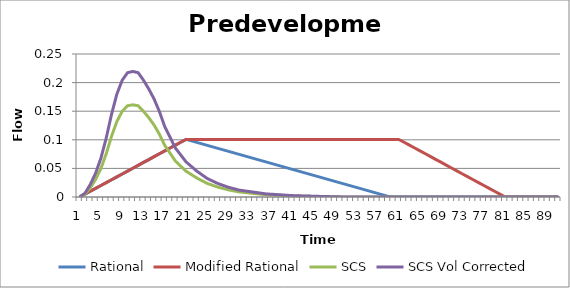
| Category | Rational | Modified Rational | SCS | SCS Vol Corrected |
|---|---|---|---|---|
| 0 | 0 | 0 | 0 | 0 |
| 1 | 0.005 | 0.005 | 0.005 | 0.007 |
| 2 | 0.01 | 0.01 | 0.016 | 0.022 |
| 3 | 0.015 | 0.015 | 0.031 | 0.042 |
| 4 | 0.02 | 0.02 | 0.05 | 0.068 |
| 5 | 0.025 | 0.025 | 0.076 | 0.103 |
| 6 | 0.03 | 0.03 | 0.106 | 0.145 |
| 7 | 0.035 | 0.035 | 0.132 | 0.18 |
| 8 | 0.04 | 0.04 | 0.15 | 0.204 |
| 9 | 0.045 | 0.045 | 0.16 | 0.217 |
| 10 | 0.05 | 0.05 | 0.161 | 0.22 |
| 11 | 0.055 | 0.055 | 0.16 | 0.217 |
| 12 | 0.06 | 0.06 | 0.15 | 0.204 |
| 13 | 0.065 | 0.065 | 0.139 | 0.189 |
| 14 | 0.07 | 0.07 | 0.126 | 0.171 |
| 15 | 0.076 | 0.076 | 0.11 | 0.149 |
| 16 | 0.081 | 0.081 | 0.09 | 0.123 |
| 17 | 0.086 | 0.086 | 0.077 | 0.104 |
| 18 | 0.091 | 0.091 | 0.063 | 0.086 |
| 19 | 0.096 | 0.096 | 0.054 | 0.074 |
| 20 | 0.101 | 0.101 | 0.045 | 0.061 |
| 21 | 0.098 | 0.101 | 0.039 | 0.053 |
| 22 | 0.095 | 0.101 | 0.033 | 0.045 |
| 23 | 0.093 | 0.101 | 0.029 | 0.039 |
| 24 | 0.09 | 0.101 | 0.024 | 0.032 |
| 25 | 0.088 | 0.101 | 0.02 | 0.028 |
| 26 | 0.085 | 0.101 | 0.017 | 0.023 |
| 27 | 0.082 | 0.101 | 0.015 | 0.02 |
| 28 | 0.08 | 0.101 | 0.012 | 0.017 |
| 29 | 0.077 | 0.101 | 0.011 | 0.014 |
| 30 | 0.074 | 0.101 | 0.009 | 0.012 |
| 31 | 0.072 | 0.101 | 0.008 | 0.011 |
| 32 | 0.069 | 0.101 | 0.007 | 0.009 |
| 33 | 0.067 | 0.101 | 0.006 | 0.008 |
| 34 | 0.064 | 0.101 | 0.005 | 0.007 |
| 35 | 0.061 | 0.101 | 0.004 | 0.005 |
| 36 | 0.059 | 0.101 | 0.004 | 0.005 |
| 37 | 0.056 | 0.101 | 0.003 | 0.004 |
| 38 | 0.053 | 0.101 | 0.003 | 0.004 |
| 39 | 0.051 | 0.101 | 0.002 | 0.003 |
| 40 | 0.048 | 0.101 | 0.002 | 0.002 |
| 41 | 0.046 | 0.101 | 0.002 | 0.002 |
| 42 | 0.043 | 0.101 | 0.001 | 0.002 |
| 43 | 0.04 | 0.101 | 0.001 | 0.002 |
| 44 | 0.038 | 0.101 | 0.001 | 0.001 |
| 45 | 0.035 | 0.101 | 0.001 | 0.001 |
| 46 | 0.032 | 0.101 | 0.001 | 0.001 |
| 47 | 0.03 | 0.101 | 0 | 0.001 |
| 48 | 0.027 | 0.101 | 0 | 0 |
| 49 | 0.025 | 0.101 | 0 | 0 |
| 50 | 0.022 | 0.101 | 0 | 0 |
| 51 | 0.019 | 0.101 | 0 | 0 |
| 52 | 0.017 | 0.101 | 0 | 0 |
| 53 | 0.014 | 0.101 | 0 | 0 |
| 54 | 0.012 | 0.101 | 0 | 0 |
| 55 | 0.009 | 0.101 | 0 | 0 |
| 56 | 0.006 | 0.101 | 0 | 0 |
| 57 | 0.004 | 0.101 | 0 | 0 |
| 58 | 0.001 | 0.101 | 0 | 0 |
| 59 | 0 | 0.101 | 0 | 0 |
| 60 | 0 | 0.101 | 0 | 0 |
| 61 | 0 | 0.096 | 0 | 0 |
| 62 | 0 | 0.091 | 0 | 0 |
| 63 | 0 | 0.086 | 0 | 0 |
| 64 | 0 | 0.081 | 0 | 0 |
| 65 | 0 | 0.076 | 0 | 0 |
| 66 | 0 | 0.07 | 0 | 0 |
| 67 | 0 | 0.065 | 0 | 0 |
| 68 | 0 | 0.06 | 0 | 0 |
| 69 | 0 | 0.055 | 0 | 0 |
| 70 | 0 | 0.05 | 0 | 0 |
| 71 | 0 | 0.045 | 0 | 0 |
| 72 | 0 | 0.04 | 0 | 0 |
| 73 | 0 | 0.035 | 0 | 0 |
| 74 | 0 | 0.03 | 0 | 0 |
| 75 | 0 | 0.025 | 0 | 0 |
| 76 | 0 | 0.02 | 0 | 0 |
| 77 | 0 | 0.015 | 0 | 0 |
| 78 | 0 | 0.01 | 0 | 0 |
| 79 | 0 | 0.005 | 0 | 0 |
| 80 | 0 | 0 | 0 | 0 |
| 81 | 0 | 0 | 0 | 0 |
| 82 | 0 | 0 | 0 | 0 |
| 83 | 0 | 0 | 0 | 0 |
| 84 | 0 | 0 | 0 | 0 |
| 85 | 0 | 0 | 0 | 0 |
| 86 | 0 | 0 | 0 | 0 |
| 87 | 0 | 0 | 0 | 0 |
| 88 | 0 | 0 | 0 | 0 |
| 89 | 0 | 0 | 0 | 0 |
| 90 | 0 | 0 | 0 | 0 |